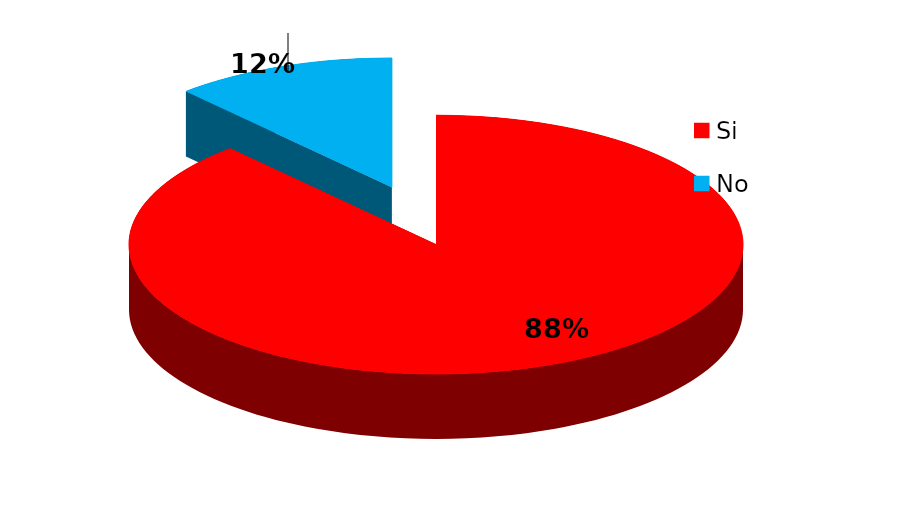
| Category | Series 0 |
|---|---|
| Si | 166 |
| No | 22 |